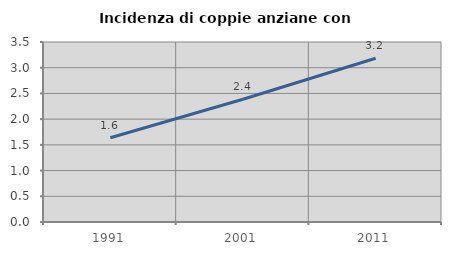
| Category | Incidenza di coppie anziane con figli |
|---|---|
| 1991.0 | 1.639 |
| 2001.0 | 2.387 |
| 2011.0 | 3.184 |